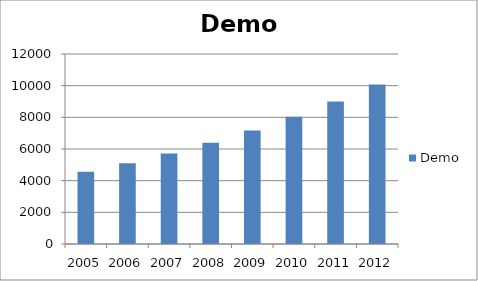
| Category | Demo |
|---|---|
| 2005.0 | 4556 |
| 2006.0 | 5102.72 |
| 2007.0 | 5715.046 |
| 2008.0 | 6400.852 |
| 2009.0 | 7168.954 |
| 2010.0 | 8029.229 |
| 2011.0 | 8992.736 |
| 2012.0 | 10071.864 |